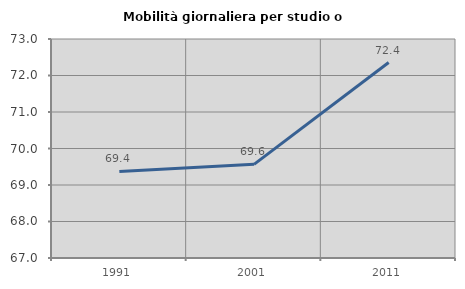
| Category | Mobilità giornaliera per studio o lavoro |
|---|---|
| 1991.0 | 69.371 |
| 2001.0 | 69.566 |
| 2011.0 | 72.356 |